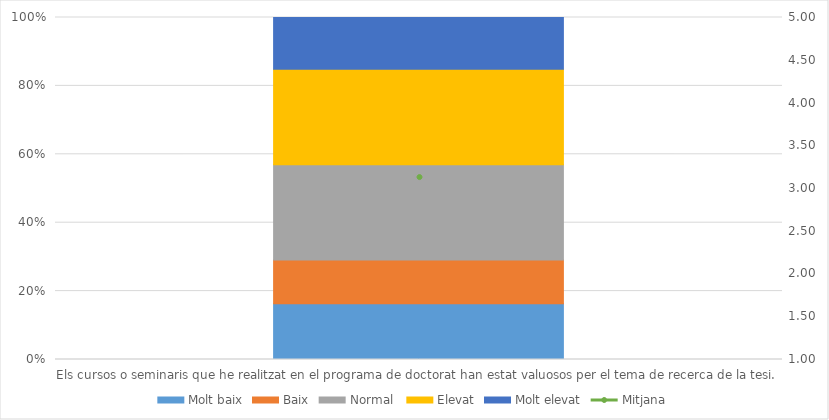
| Category | Molt baix | Baix | Normal  | Elevat | Molt elevat |
|---|---|---|---|---|---|
| Els cursos o seminaris que he realitzat en el programa de doctorat han estat valuosos per el tema de recerca de la tesi. | 14 | 11 | 24 | 24 | 13 |